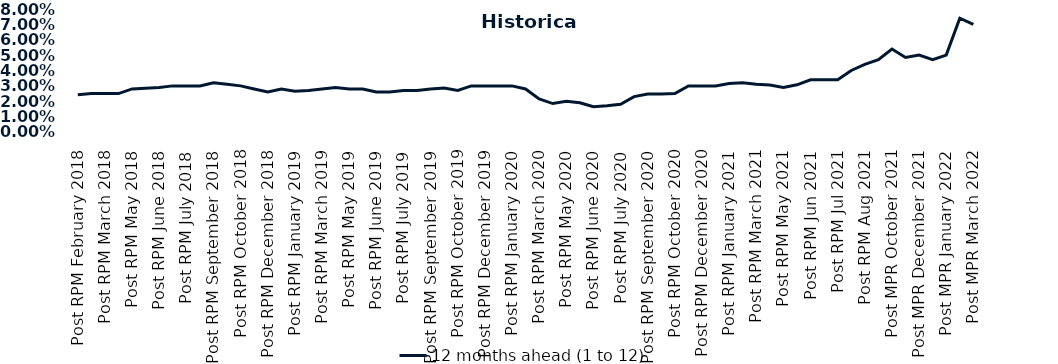
| Category | 12 months ahead (1 to 12)  |
|---|---|
| Post RPM February 2018 | 0.024 |
| Pre RPM March 2018 | 0.025 |
| Post RPM March 2018 | 0.025 |
| Pre RPM May 2018 | 0.025 |
| Post RPM May 2018 | 0.028 |
| Pre RPM June 2018 | 0.028 |
| Post RPM June 2018 | 0.029 |
| Pre RPM July 2018 | 0.03 |
| Post RPM July 2018 | 0.03 |
| Pre RPM September 2018 | 0.03 |
| Post RPM September 2018 | 0.032 |
| Pre RPM October 2018 | 0.031 |
| Post RPM October 2018 | 0.03 |
| Pre RPM December 2018 | 0.028 |
| Post RPM December 2018 | 0.026 |
| Pre RPM January 2019 | 0.028 |
| Post RPM January 2019 | 0.026 |
| Pre RPM March 2019 | 0.027 |
| Post RPM March 2019 | 0.028 |
| Pre RPM May 2019 | 0.029 |
| Post RPM May 2019 | 0.028 |
| Pre RPM June 2019 | 0.028 |
| Post RPM June 2019 | 0.026 |
| Pre RPM July 2019 | 0.026 |
| Post RPM July 2019 | 0.027 |
| Pre RPM September 2019 | 0.027 |
| Post RPM September 2019 | 0.028 |
| Pre RPM October 2019 | 0.029 |
| Post RPM October 2019 | 0.027 |
| Pre RPM December 2019 | 0.03 |
| Post RPM December 2019 | 0.03 |
| Pre RPM January 2020 | 0.03 |
| Post RPM January 2020 | 0.03 |
| Pre RPM March 2020 | 0.028 |
| Post RPM March 2020 | 0.022 |
| Pre RPM May 2020 | 0.018 |
| Post RPM May 2020 | 0.02 |
| Pre RPM June 2020 | 0.019 |
| Post RPM June 2020 | 0.016 |
| Pre RPM July 2020 | 0.017 |
| Post RPM July 2020 | 0.018 |
| Pre RPM September 2020 | 0.023 |
| Post RPM September 2020 | 0.025 |
| Pre RPM October 2020 | 0.025 |
| Post RPM October 2020 | 0.025 |
| Pre RPM December 2020 | 0.03 |
|  Post RPM December 2020 | 0.03 |
| Pre RPM January 2021 | 0.03 |
| Post RPM January 2021 | 0.032 |
|  Pre RPM March 2021 | 0.032 |
|  Post RPM March 2021 | 0.031 |
|  Pre RPM May 2021 | 0.03 |
|  Post RPM May 2021 | 0.029 |
|  Pre RPM Jun 2021 | 0.031 |
|   Post RPM Jun 2021 | 0.034 |
| Pre RPM Jul 2021 | 0.034 |
|  Post RPM Jul 2021 | 0.034 |
| Pre RPM Aug 2021 | 0.04 |
|  Post RPM Aug 2021 | 0.044 |
| Pre MPR October 2021 | 0.047 |
| Post MPR October 2021 | 0.054 |
| Pre MPR December 2021 | 0.048 |
| Post MPR December 2021 | 0.05 |
| Pre MPR January 2022 | 0.047 |
| Post MPR January 2022 | 0.05 |
| Pre MPR March 2022 | 0.074 |
| Post MPR March 2022 | 0.07 |